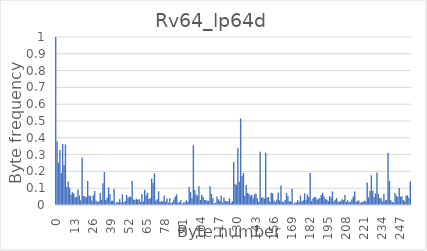
| Category | Series 0 |
|---|---|
| 0.0 | 1 |
| 1.0 | 0.378 |
| 2.0 | 0.252 |
| 3.0 | 0.327 |
| 4.0 | 0.19 |
| 5.0 | 0.363 |
| 6.0 | 0.238 |
| 7.0 | 0.361 |
| 8.0 | 0.107 |
| 9.0 | 0.14 |
| 10.0 | 0.102 |
| 11.0 | 0.061 |
| 12.0 | 0.076 |
| 13.0 | 0.068 |
| 14.0 | 0.046 |
| 15.0 | 0.048 |
| 16.0 | 0.092 |
| 17.0 | 0.057 |
| 18.0 | 0.029 |
| 19.0 | 0.282 |
| 20.0 | 0.054 |
| 21.0 | 0.052 |
| 22.0 | 0.045 |
| 23.0 | 0.143 |
| 24.0 | 0.057 |
| 25.0 | 0.053 |
| 26.0 | 0.027 |
| 27.0 | 0.057 |
| 28.0 | 0.084 |
| 29.0 | 0.026 |
| 30.0 | 0.019 |
| 31.0 | 0.023 |
| 32.0 | 0.071 |
| 33.0 | 0.031 |
| 34.0 | 0.129 |
| 35.0 | 0.196 |
| 36.0 | 0.029 |
| 37.0 | 0.044 |
| 38.0 | 0.105 |
| 39.0 | 0.066 |
| 40.0 | 0.025 |
| 41.0 | 0.025 |
| 42.0 | 0.095 |
| 43.0 | 0.009 |
| 44.0 | 0.019 |
| 45.0 | 0.015 |
| 46.0 | 0.034 |
| 47.0 | 0.017 |
| 48.0 | 0.064 |
| 49.0 | 0.014 |
| 50.0 | 0.024 |
| 51.0 | 0.06 |
| 52.0 | 0.042 |
| 53.0 | 0.05 |
| 54.0 | 0.049 |
| 55.0 | 0.143 |
| 56.0 | 0.032 |
| 57.0 | 0.03 |
| 58.0 | 0.038 |
| 59.0 | 0.029 |
| 60.0 | 0.036 |
| 61.0 | 0.018 |
| 62.0 | 0.066 |
| 63.0 | 0.021 |
| 64.0 | 0.091 |
| 65.0 | 0.059 |
| 66.0 | 0.073 |
| 67.0 | 0.035 |
| 68.0 | 0.042 |
| 69.0 | 0.158 |
| 70.0 | 0.131 |
| 71.0 | 0.188 |
| 72.0 | 0.025 |
| 73.0 | 0.034 |
| 74.0 | 0.082 |
| 75.0 | 0.02 |
| 76.0 | 0.021 |
| 77.0 | 0.023 |
| 78.0 | 0.056 |
| 79.0 | 0.02 |
| 80.0 | 0.039 |
| 81.0 | 0.014 |
| 82.0 | 0.041 |
| 83.0 | 0.011 |
| 84.0 | 0.018 |
| 85.0 | 0.032 |
| 86.0 | 0.05 |
| 87.0 | 0.063 |
| 88.0 | 0.015 |
| 89.0 | 0.018 |
| 90.0 | 0.03 |
| 91.0 | 0.008 |
| 92.0 | 0.016 |
| 93.0 | 0.017 |
| 94.0 | 0.028 |
| 95.0 | 0.019 |
| 96.0 | 0.108 |
| 97.0 | 0.076 |
| 98.0 | 0.041 |
| 99.0 | 0.356 |
| 100.0 | 0.089 |
| 101.0 | 0.063 |
| 102.0 | 0.056 |
| 103.0 | 0.112 |
| 104.0 | 0.03 |
| 105.0 | 0.061 |
| 106.0 | 0.048 |
| 107.0 | 0.03 |
| 108.0 | 0.029 |
| 109.0 | 0.026 |
| 110.0 | 0.025 |
| 111.0 | 0.112 |
| 112.0 | 0.065 |
| 113.0 | 0.04 |
| 114.0 | 0.01 |
| 115.0 | 0.013 |
| 116.0 | 0.051 |
| 117.0 | 0.034 |
| 118.0 | 0.024 |
| 119.0 | 0.057 |
| 120.0 | 0.015 |
| 121.0 | 0.045 |
| 122.0 | 0.024 |
| 123.0 | 0.02 |
| 124.0 | 0.023 |
| 125.0 | 0.04 |
| 126.0 | 0.011 |
| 127.0 | 0.022 |
| 128.0 | 0.256 |
| 129.0 | 0.127 |
| 130.0 | 0.12 |
| 131.0 | 0.337 |
| 132.0 | 0.138 |
| 133.0 | 0.515 |
| 134.0 | 0.171 |
| 135.0 | 0.19 |
| 136.0 | 0.055 |
| 137.0 | 0.119 |
| 138.0 | 0.072 |
| 139.0 | 0.066 |
| 140.0 | 0.055 |
| 141.0 | 0.06 |
| 142.0 | 0.039 |
| 143.0 | 0.063 |
| 144.0 | 0.068 |
| 145.0 | 0.041 |
| 146.0 | 0.018 |
| 147.0 | 0.318 |
| 148.0 | 0.044 |
| 149.0 | 0.044 |
| 150.0 | 0.039 |
| 151.0 | 0.311 |
| 152.0 | 0.044 |
| 153.0 | 0.048 |
| 154.0 | 0.02 |
| 155.0 | 0.073 |
| 156.0 | 0.069 |
| 157.0 | 0.027 |
| 158.0 | 0.018 |
| 159.0 | 0.032 |
| 160.0 | 0.074 |
| 161.0 | 0.028 |
| 162.0 | 0.116 |
| 163.0 | 0.02 |
| 164.0 | 0.018 |
| 165.0 | 0.03 |
| 166.0 | 0.071 |
| 167.0 | 0.052 |
| 168.0 | 0.021 |
| 169.0 | 0.022 |
| 170.0 | 0.097 |
| 171.0 | 0.009 |
| 172.0 | 0.014 |
| 173.0 | 0.015 |
| 174.0 | 0.029 |
| 175.0 | 0.018 |
| 176.0 | 0.056 |
| 177.0 | 0.02 |
| 178.0 | 0.027 |
| 179.0 | 0.07 |
| 180.0 | 0.028 |
| 181.0 | 0.063 |
| 182.0 | 0.048 |
| 183.0 | 0.192 |
| 184.0 | 0.024 |
| 185.0 | 0.039 |
| 186.0 | 0.047 |
| 187.0 | 0.044 |
| 188.0 | 0.032 |
| 189.0 | 0.038 |
| 190.0 | 0.041 |
| 191.0 | 0.059 |
| 192.0 | 0.072 |
| 193.0 | 0.051 |
| 194.0 | 0.035 |
| 195.0 | 0.031 |
| 196.0 | 0.024 |
| 197.0 | 0.054 |
| 198.0 | 0.043 |
| 199.0 | 0.081 |
| 200.0 | 0.02 |
| 201.0 | 0.031 |
| 202.0 | 0.042 |
| 203.0 | 0.021 |
| 204.0 | 0.017 |
| 205.0 | 0.024 |
| 206.0 | 0.035 |
| 207.0 | 0.028 |
| 208.0 | 0.06 |
| 209.0 | 0.02 |
| 210.0 | 0.029 |
| 211.0 | 0.016 |
| 212.0 | 0.02 |
| 213.0 | 0.033 |
| 214.0 | 0.051 |
| 215.0 | 0.081 |
| 216.0 | 0.019 |
| 217.0 | 0.026 |
| 218.0 | 0.026 |
| 219.0 | 0.012 |
| 220.0 | 0.019 |
| 221.0 | 0.018 |
| 222.0 | 0.026 |
| 223.0 | 0.023 |
| 224.0 | 0.134 |
| 225.0 | 0.045 |
| 226.0 | 0.084 |
| 227.0 | 0.177 |
| 228.0 | 0.085 |
| 229.0 | 0.048 |
| 230.0 | 0.07 |
| 231.0 | 0.193 |
| 232.0 | 0.066 |
| 233.0 | 0.04 |
| 234.0 | 0.04 |
| 235.0 | 0.021 |
| 236.0 | 0.066 |
| 237.0 | 0.027 |
| 238.0 | 0.031 |
| 239.0 | 0.31 |
| 240.0 | 0.144 |
| 241.0 | 0.029 |
| 242.0 | 0.018 |
| 243.0 | 0.015 |
| 244.0 | 0.072 |
| 245.0 | 0.055 |
| 246.0 | 0.047 |
| 247.0 | 0.102 |
| 248.0 | 0.05 |
| 249.0 | 0.051 |
| 250.0 | 0.029 |
| 251.0 | 0.022 |
| 252.0 | 0.056 |
| 253.0 | 0.058 |
| 254.0 | 0.042 |
| 255.0 | 0.14 |